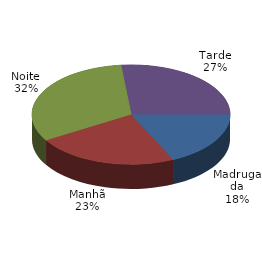
| Category | Qtde Vítimas |
|---|---|
| Madrugada | 299 |
| Manhã | 387 |
| Noite | 531 |
| Tarde | 442 |